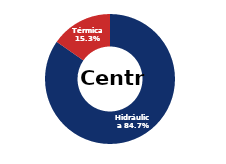
| Category | Centro |
|---|---|
| Eólica | 0 |
| Hidráulica | 2340.025 |
| Solar | 0.006 |
| Térmica | 422.824 |